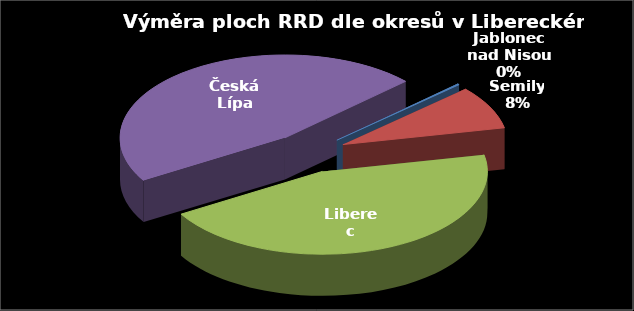
| Category | Výměra [ha] |
|---|---|
| Jablonec nad Nisou | 0.24 |
| Semily | 8.79 |
| Liberec | 46.33 |
| Česká Lípa | 48.47 |